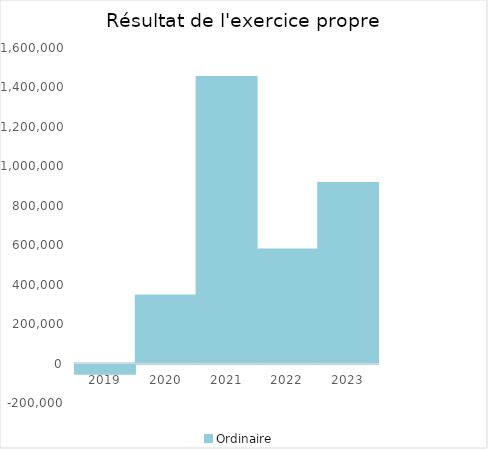
| Category |   | Ordinaire |    |
|---|---|---|---|
| 2019.0 |  | -49924.62 |  |
| 2020.0 |  | 345611.68 |  |
| 2021.0 |  | 1452875.73 |  |
| 2022.0 |  | 578496.72 |  |
| 2023.0 |  | 915312.54 |  |